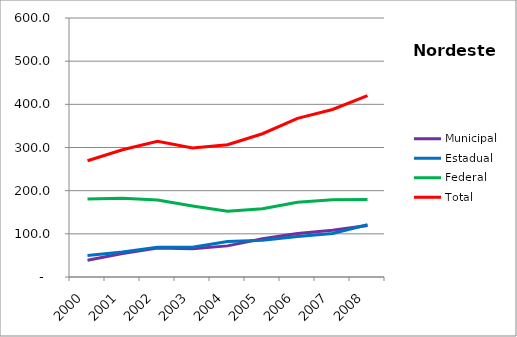
| Category | Municipal | Estadual | Federal | Total |
|---|---|---|---|---|
| 2000.0 | 39 | 49.6 | 180.6 | 269.2 |
| 2001.0 | 54.3 | 57.9 | 182.5 | 294.7 |
| 2002.0 | 67.4 | 68.7 | 178.2 | 314.3 |
| 2003.0 | 65.4 | 69.1 | 164.4 | 298.9 |
| 2004.0 | 72.1 | 82 | 152.2 | 306.4 |
| 2005.0 | 88.5 | 85.4 | 158 | 331.9 |
| 2006.0 | 100.8 | 93.7 | 173.1 | 367.5 |
| 2007.0 | 108.1 | 100.7 | 179.2 | 388 |
| 2008.0 | 119.4 | 120.9 | 179.7 | 420 |